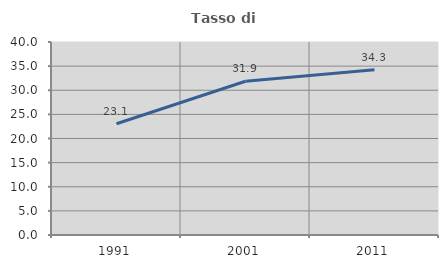
| Category | Tasso di occupazione   |
|---|---|
| 1991.0 | 23.054 |
| 2001.0 | 31.868 |
| 2011.0 | 34.251 |